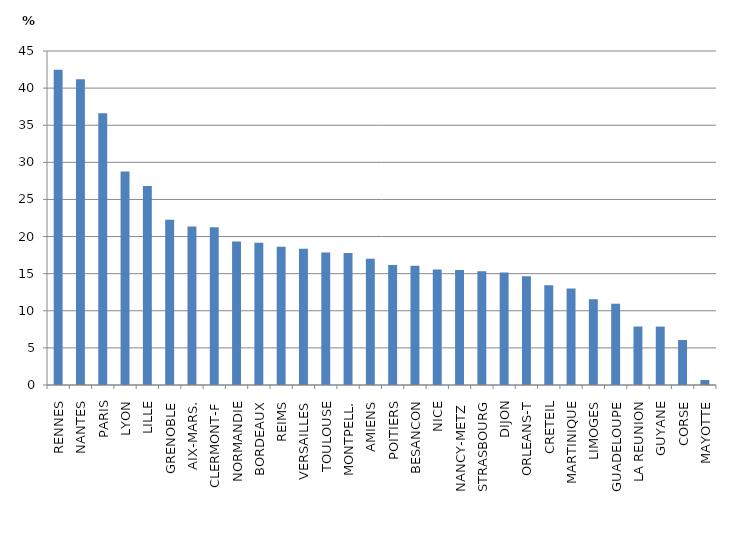
| Category | Part du secteur privé dans le second degré |
|---|---|
| RENNES | 42.467 |
| NANTES | 41.193 |
| PARIS | 36.6 |
| LYON | 28.767 |
| LILLE | 26.806 |
| GRENOBLE | 22.254 |
| AIX-MARS. | 21.369 |
| CLERMONT-F | 21.261 |
| NORMANDIE | 19.332 |
| BORDEAUX | 19.149 |
| REIMS | 18.627 |
| VERSAILLES | 18.372 |
| TOULOUSE | 17.863 |
| MONTPELL. | 17.79 |
| AMIENS | 17.02 |
| POITIERS | 16.182 |
| BESANCON | 16.076 |
| NICE | 15.563 |
| NANCY-METZ  | 15.503 |
| STRASBOURG | 15.337 |
| DIJON | 15.157 |
| ORLEANS-T | 14.638 |
| CRETEIL | 13.441 |
| MARTINIQUE | 12.99 |
| LIMOGES | 11.548 |
| GUADELOUPE | 10.952 |
| LA REUNION | 7.878 |
| GUYANE | 7.87 |
| CORSE | 6.06 |
| MAYOTTE | 0.672 |